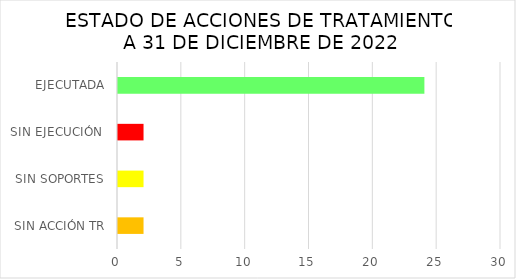
| Category | Series 0 |
|---|---|
| SIN ACCIÓN TR | 2 |
| SIN SOPORTES | 2 |
| SIN EJECUCIÓN  | 2 |
| EJECUTADA | 24 |